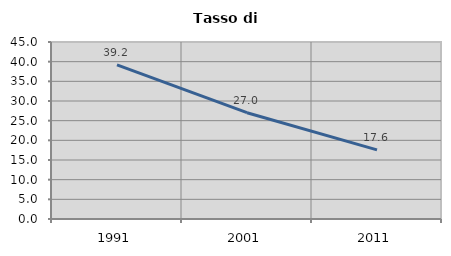
| Category | Tasso di disoccupazione   |
|---|---|
| 1991.0 | 39.206 |
| 2001.0 | 27.023 |
| 2011.0 | 17.572 |